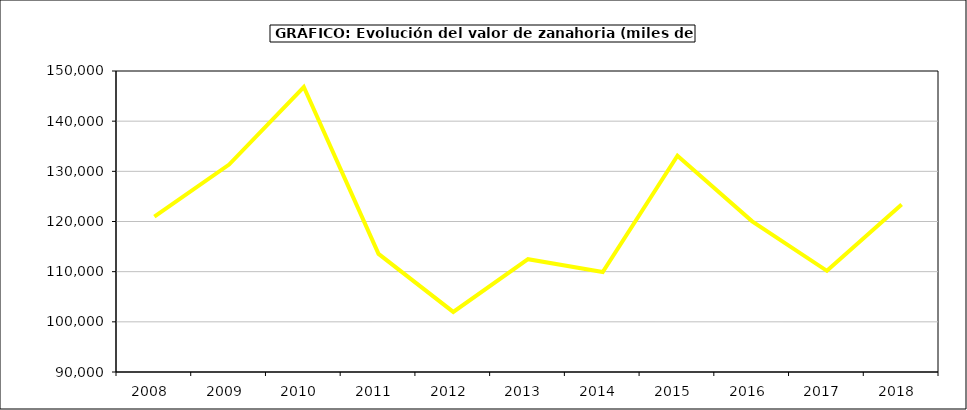
| Category | Valor |
|---|---|
| 2008.0 | 120953.143 |
| 2009.0 | 131354.206 |
| 2010.0 | 146811.606 |
| 2011.0 | 113537.975 |
| 2012.0 | 101980.864 |
| 2013.0 | 112485.085 |
| 2014.0 | 109919.203 |
| 2015.0 | 133120 |
| 2016.0 | 120031 |
| 2017.0 | 110169.914 |
| 2018.0 | 123370.95 |